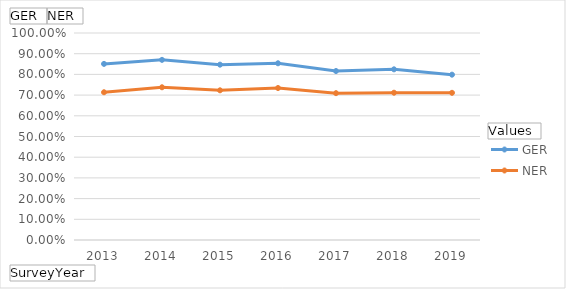
| Category | GER | NER |
|---|---|---|
| 2013 | 0.851 | 0.714 |
| 2014 | 0.87 | 0.738 |
| 2015 | 0.847 | 0.723 |
| 2016 | 0.854 | 0.734 |
| 2017 | 0.816 | 0.709 |
| 2018 | 0.824 | 0.712 |
| 2019 | 0.799 | 0.711 |